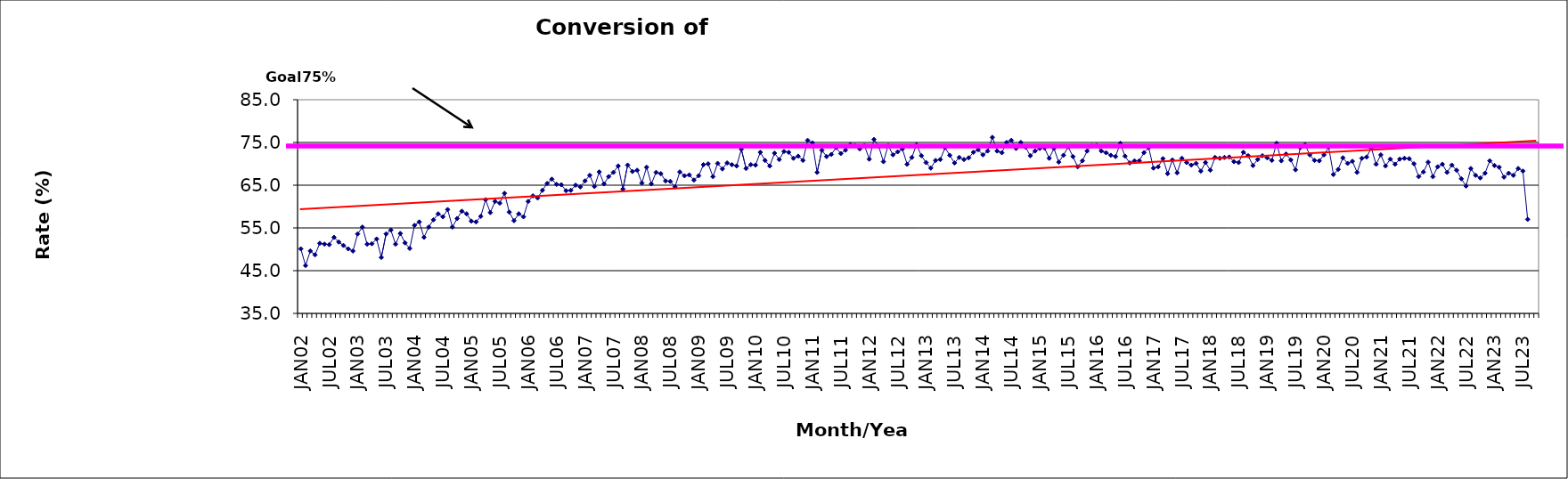
| Category | Series 0 |
|---|---|
| JAN02 | 50.1 |
| FEB02 | 46.2 |
| MAR02 | 49.6 |
| APR02 | 48.7 |
| MAY02 | 51.4 |
| JUN02 | 51.2 |
| JUL02 | 51.1 |
| AUG02 | 52.8 |
| SEP02 | 51.7 |
| OCT02 | 50.9 |
| NOV02 | 50.1 |
| DEC02 | 49.6 |
| JAN03 | 53.6 |
| FEB03 | 55.2 |
| MAR03 | 51.2 |
| APR03 | 51.3 |
| MAY03 | 52.4 |
| JUN03 | 48.1 |
| JUL03 | 53.6 |
| AUG03 | 54.5 |
| SEP03 | 51.2 |
| OCT03 | 53.7 |
| NOV03 | 51.5 |
| DEC03 | 50.2 |
| JAN04 | 55.6 |
| FEB04 | 56.4 |
| MAR04 | 52.8 |
| APR04 | 55.2 |
| MAY04 | 56.9 |
| JUN04 | 58.3 |
| JUL04 | 57.6 |
| AUG04 | 59.3 |
| SEP04 | 55.2 |
| OCT04 | 57.2 |
| NOV04 | 58.9 |
| DEC04 | 58.3 |
| JAN05 | 56.6 |
| FEB05 | 56.4 |
| MAR05 | 57.7 |
| APR05 | 61.6 |
| MAY05 | 58.6 |
| JUN05 | 61.2 |
| JUL05 | 60.8 |
| AUG05 | 63.1 |
| SEP05 | 58.7 |
| OCT05 | 56.7 |
| NOV05 | 58.3 |
| DEC05 | 57.6 |
| JAN06 | 61.2 |
| FEB06 | 62.5 |
| MAR06 | 62 |
| APR06 | 63.8 |
| MAY06 | 65.4 |
| JUN06 | 66.4 |
| JUL06 | 65.2 |
| AUG06 | 65.1 |
| SEP06 | 63.7 |
| OCT06 | 63.8 |
| NOV06 | 65 |
| DEC06 | 64.6 |
| JAN07 | 66 |
| FEB07 | 67.3 |
| MAR07 | 64.7 |
| APR07 | 68.1 |
| MAY07 | 65.3 |
| JUN07 | 67 |
| JUL07 | 68 |
| AUG07 | 69.5 |
| SEP07 | 64.1 |
| OCT07 | 69.7 |
| NOV07 | 68.2 |
| DEC07 | 68.5 |
| JAN08 | 65.5 |
| FEB08 | 69.2 |
| MAR08 | 65.3 |
| APR08 | 68 |
| MAY08 | 67.7 |
| JUN08 | 66 |
| JUL08 | 65.9 |
| AUG08 | 64.6 |
| SEP08 | 68.1 |
| OCT08 | 67.2 |
| NOV08 | 67.4 |
| DEC08 | 66.2 |
| JAN09 | 67.2 |
| FEB09 | 69.8 |
| MAR09 | 70 |
| APR09 | 67 |
| MAY09 | 70.1 |
| JUN09 | 68.8 |
| JUL09 | 70.2 |
| AUG09 | 69.8 |
| SEP09 | 69.5 |
| OCT09 | 73.4 |
| NOV09 | 68.9 |
| DEC09 | 69.8 |
| JAN10 | 69.7 |
| FEB10 | 72.7 |
| MAR10 | 70.8 |
| APR10 | 69.5 |
| MAY10 | 72.5 |
| JUN10 | 71 |
| JUL10 | 72.9 |
| AUG10 | 72.7 |
| SEP10 | 71.3 |
| OCT10 | 71.8 |
| NOV10 | 70.8 |
| DEC10 | 75.5 |
| JAN11 | 74.9 |
| FEB11 | 68 |
| MAR11 | 73.2 |
| APR11 | 71.7 |
| MAY11 | 72.2 |
| JUN11 | 73.8 |
| JUL11 | 72.4 |
| AUG11 | 73.2 |
| SEP11 | 74.5 |
| OCT11 | 74.3 |
| NOV11 | 73.5 |
| DEC11 | 74.3 |
| JAN12 | 71.1 |
| FEB12 | 75.7 |
| MAR12 | 74.1 |
| APR12 | 70.5 |
| MAY12 | 74.3 |
| JUN12 | 72.1 |
| JUL12 | 72.8 |
| AUG12 | 73.5 |
| SEP12 | 69.9 |
| OCT12 | 71.5 |
| NOV12 | 74.5 |
| DEC12 | 71.9 |
| JAN13 | 70.3 |
| FEB13 | 69 |
| MAR13 | 70.8 |
| APR13 | 71 |
| MAY13 | 73.8 |
| JUN13 | 72 |
| JUL13 | 70.2 |
| AUG13 | 71.5 |
| SEP13 | 71 |
| OCT13 | 71.4 |
| NOV13 | 72.7 |
| DEC13 | 73.3 |
| JAN14 | 72.1 |
| FEB14 | 73 |
| MAR14 | 76.2 |
| APR14 | 73 |
| MAY14 | 72.6 |
| JUN14 | 75 |
| JUL14 | 75.5 |
| AUG14 | 73.6 |
| SEP14 | 75 |
| OCT14 | 73.9 |
| NOV14 | 71.9 |
| DEC14 | 73 |
| JAN15 | 73.6 |
| FEB15 | 73.7 |
| MAR15 | 71.3 |
| APR15 | 73.6 |
| MAY15 | 70.4 |
| JUN15 | 72 |
| JUL15 | 74 |
| AUG15 | 71.7 |
| SEP15 | 69.3 |
| OCT15 | 70.7 |
| NOV15 | 73 |
| DEC15 | 74.2 |
| JAN16 | 74.3 |
| FEB16 | 73 |
| MAR16 | 72.6 |
| APR16 | 72 |
| MAY16 | 71.7 |
| JUN16 | 74.8 |
| JUL16 | 71.8 |
| AUG16 | 70.2 |
| SEP16 | 70.7 |
| OCT16 | 70.7 |
| NOV16 | 72.6 |
| DEC16 | 73.8 |
| JAN17 | 69 |
| FEB17 | 69.3 |
| MAR17 | 71.2 |
| APR17 | 67.7 |
| MAY17 | 70.9 |
| JUN17 | 67.9 |
| JUL17 | 71.3 |
| AUG17 | 70.3 |
| SEP17 | 69.7 |
| OCT17 | 70.1 |
| NOV17 | 68.3 |
| DEC17 | 70.3 |
| JAN18 | 68.5 |
| FEB18 | 71.5 |
| MAR18 | 71.3 |
| APR18 | 71.5 |
| MAY18 | 71.6 |
| JUN18 | 70.5 |
| JUL18 | 70.3 |
| AUG18 | 72.7 |
| SEP18 | 71.9 |
| OCT18 | 69.6 |
| NOV18 | 71 |
| DEC18 | 71.9 |
| JAN19 | 71.4 |
| FEB19 | 70.8 |
| MAR19 | 74.8 |
| APR19 | 70.7 |
| MAY19 | 72.3 |
| JUN19 | 70.9 |
| JUL19 | 68.6 |
| AUG19 | 73.8 |
| SEP19 | 74.5 |
| OCT19 | 72.1 |
| NOV19 | 70.8 |
| DEC19 | 70.7 |
| JAN20 | 72.1 |
| FEB20 | 73.9 |
| MAR20 | 67.5 |
| APR20 | 68.7 |
| MAY20 | 71.4 |
| JUN20 | 70.1 |
| JUL20 | 70.6 |
| AUG20 | 68 |
| SEP20 | 71.3 |
| OCT20 | 71.6 |
| NOV20 | 73.7 |
| DEC20 | 69.9 |
| JAN21 | 72.1 |
| FEB21 | 69.5 |
| MAR21 | 71.1 |
| APR21 | 69.9 |
| MAY21 | 71.1 |
| JUN21 | 71.3 |
| JUL21 | 71.2 |
| AUG21 | 70 |
| SEP21 | 67 |
| OCT21 | 68.1 |
| NOV21 | 70.4 |
| DEC21 | 67 |
| JAN22 | 69.3 |
| FEB22 | 69.9 |
| MAR22 | 68 |
| APR22 | 69.7 |
| MAY22 | 68.5 |
| JUN22 | 66.5 |
| JUL22 | 64.8 |
| AUG22 | 68.9 |
| SEP22 | 67.3 |
| OCT22 | 66.7 |
| NOV22 | 67.8 |
| DEC22 | 70.7 |
| JAN23 | 69.6 |
| FEB23 | 69.2 |
| MAR23 | 66.9 |
| APR23 | 67.8 |
| MAY23 | 67.3 |
| JUN23 | 68.9 |
| JUL23 | 68.3 |
| AUG23 | 57 |